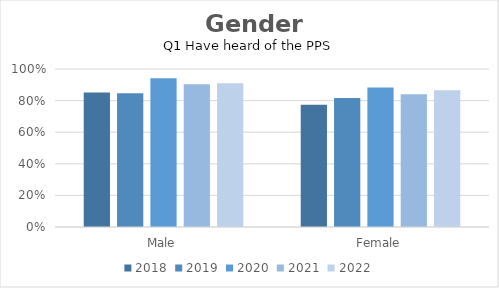
| Category | 2018 | 2019 | 2020 | 2021 | 2022 |
|---|---|---|---|---|---|
| Male | 0.852 | 0.847 | 0.942 | 0.903 | 0.91 |
| Female | 0.774 | 0.817 | 0.883 | 0.84 | 0.866 |